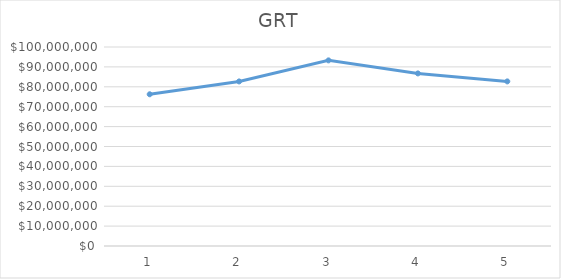
| Category | Series 0 |
|---|---|
| 0 | 76243301.63 |
| 1 | 82698539.45 |
| 2 | 93281421.86 |
| 3 | 86728519.59 |
| 4 | 82714388.49 |